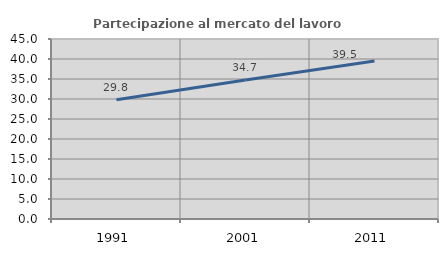
| Category | Partecipazione al mercato del lavoro  femminile |
|---|---|
| 1991.0 | 29.831 |
| 2001.0 | 34.749 |
| 2011.0 | 39.487 |